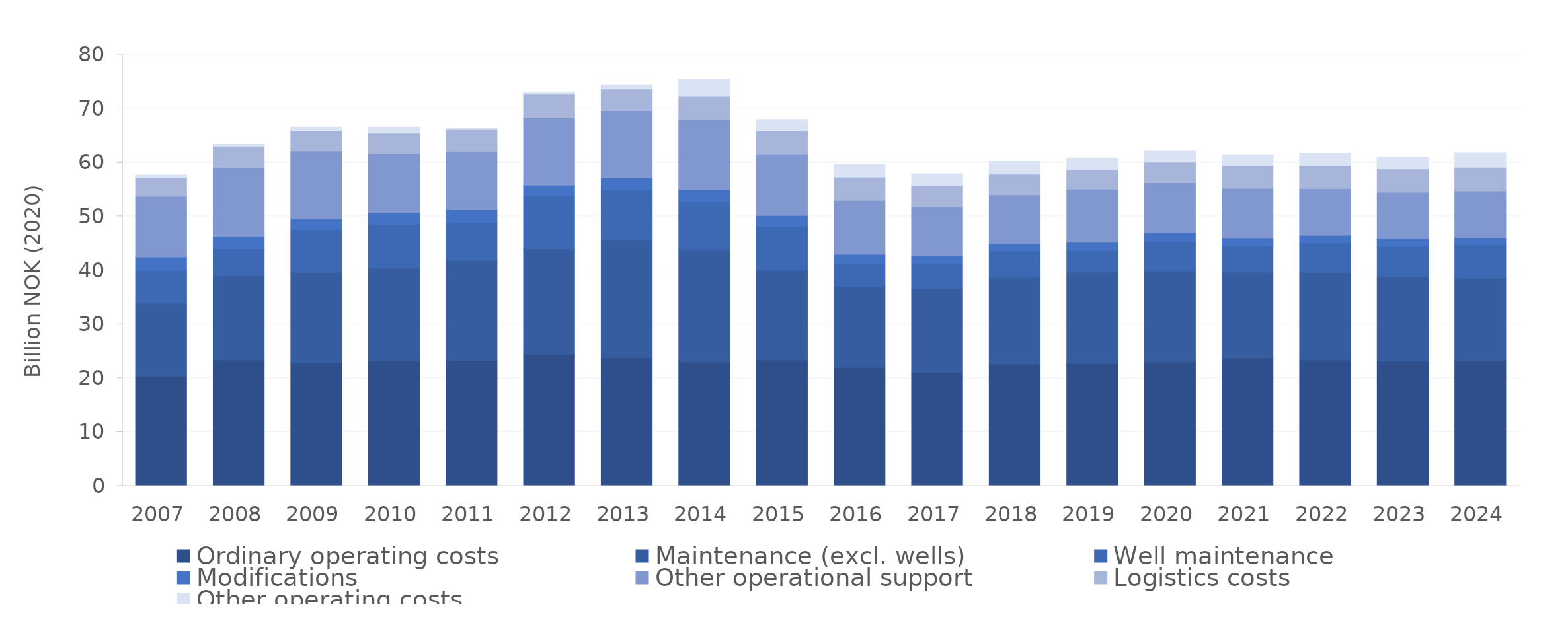
| Category | Ordinary operating costs | Maintenance (excl. wells) | Well maintenance | Modifications  | Other operational support  | Logistics costs | Other operating costs |
|---|---|---|---|---|---|---|---|
| 2007.0 | 20.339 | 13.56 | 6.076 | 2.474 | 11.283 | 3.401 | 0.502 |
| 2008.0 | 23.34 | 15.626 | 5.023 | 2.304 | 12.744 | 3.977 | 0.338 |
| 2009.0 | 22.857 | 16.736 | 7.904 | 2.034 | 12.56 | 3.817 | 0.631 |
| 2010.0 | 23.204 | 17.195 | 8.115 | 2.191 | 10.908 | 3.772 | 1.164 |
| 2011.0 | 23.241 | 18.577 | 6.946 | 2.453 | 10.779 | 4.074 | 0.204 |
| 2012.0 | 24.424 | 19.565 | 9.745 | 2.031 | 12.462 | 4.378 | 0.395 |
| 2013.0 | 23.759 | 21.775 | 9.352 | 2.197 | 12.508 | 3.993 | 0.848 |
| 2014.0 | 22.999 | 20.743 | 8.951 | 2.297 | 12.899 | 4.326 | 3.16 |
| 2015.0 | 23.332 | 16.726 | 8.08 | 2.013 | 11.381 | 4.379 | 2.05 |
| 2016.0 | 21.969 | 15.014 | 4.344 | 1.627 | 9.99 | 4.303 | 2.411 |
| 2017.0 | 21.005 | 15.531 | 4.712 | 1.461 | 9.037 | 3.958 | 2.172 |
| 2018.0 | 22.579 | 16.062 | 4.947 | 1.357 | 9.066 | 3.797 | 2.449 |
| 2019.0 | 22.705 | 16.924 | 3.987 | 1.546 | 9.872 | 3.623 | 2.141 |
| 2020.0 | 22.999 | 16.878 | 5.413 | 1.735 | 9.203 | 3.895 | 2.038 |
| 2021.0 | 23.664 | 15.983 | 4.923 | 1.332 | 9.281 | 4.101 | 2.111 |
| 2022.0 | 23.327 | 16.255 | 5.48 | 1.443 | 8.637 | 4.275 | 2.223 |
| 2023.0 | 23.127 | 15.627 | 5.674 | 1.389 | 8.625 | 4.343 | 2.199 |
| 2024.0 | 23.182 | 15.337 | 6.166 | 1.394 | 8.631 | 4.378 | 2.714 |